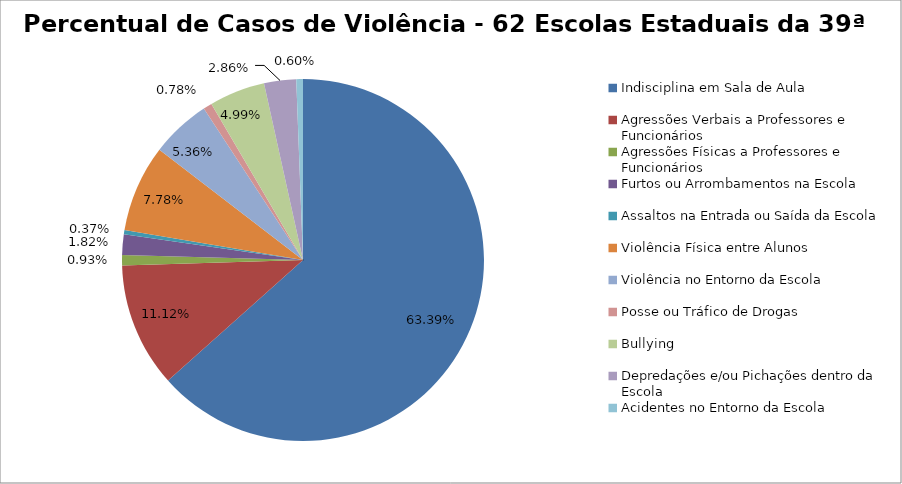
| Category | Percentual |
|---|---|
| Indisciplina em Sala de Aula | 0.634 |
| Agressões Verbais a Professores e Funcionários | 0.111 |
| Agressões Físicas a Professores e Funcionários | 0.009 |
| Furtos ou Arrombamentos na Escola | 0.018 |
| Assaltos na Entrada ou Saída da Escola | 0.004 |
| Violência Física entre Alunos | 0.078 |
| Violência no Entorno da Escola | 0.054 |
| Posse ou Tráfico de Drogas | 0.008 |
| Bullying | 0.05 |
| Depredações e/ou Pichações dentro da Escola | 0.029 |
| Acidentes no Entorno da Escola | 0.006 |